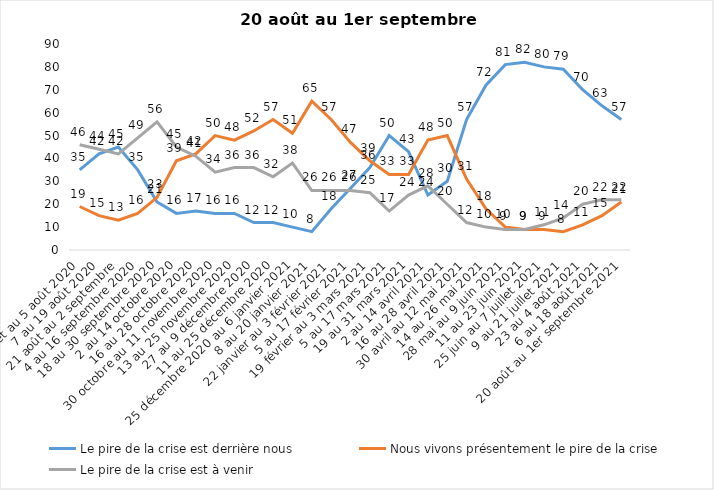
| Category | Le pire de la crise est derrière nous | Nous vivons présentement le pire de la crise | Le pire de la crise est à venir |
|---|---|---|---|
| 24 juillet au 5 août 2020 | 35 | 19 | 46 |
| 7 au 19 août 2020 | 42 | 15 | 44 |
| 21 août au 2 septembre | 45 | 13 | 42 |
| 4 au 16 septembre 2020 | 35 | 16 | 49 |
| 18 au 30 septembre 2020 | 21 | 23 | 56 |
| 2 au 14 octobre 2020 | 16 | 39 | 45 |
| 16 au 28 octobre 2020 | 17 | 42 | 41 |
| 30 octobre au 11 novembre 2020 | 16 | 50 | 34 |
| 13 au 25 novembre 2020 | 16 | 48 | 36 |
| 27 au 9 décembre 2020 | 12 | 52 | 36 |
| 11 au 25 décembre 2020 | 12 | 57 | 32 |
| 25 décembre 2020 au 6 janvier 2021 | 10 | 51 | 38 |
| 8 au 20 janvier 2021 | 8 | 65 | 26 |
| 22 janvier au 3 février 2021 | 18 | 57 | 26 |
| 5 au 17 février 2021 | 27 | 47 | 26 |
| 19 février au 3 mars 2021 | 36 | 39 | 25 |
| 5 au 17 mars 2021 | 50 | 33 | 17 |
| 19 au 31 mars 2021 | 43 | 33 | 24 |
| 2 au 14 avril 2021 | 24 | 48 | 28 |
| 16 au 28 avril 2021 | 30 | 50 | 20 |
| 30 avril au 12 mai 2021 | 57 | 31 | 12 |
| 14 au 26 mai 2021 | 72 | 18 | 10 |
| 28 mai au 9 juin 2021 | 81 | 10 | 9 |
| 11 au 23 juin 2021 | 82 | 9 | 9 |
| 25 juin au 7 juillet 2021 | 80 | 9 | 11 |
| 9 au 21 juillet 2021 | 79 | 8 | 14 |
| 23 au 4 août 2021 | 70 | 11 | 20 |
| 6 au 18 août 2021 | 63 | 15 | 22 |
| 20 août au 1er septembre 2021 | 57 | 21 | 22 |